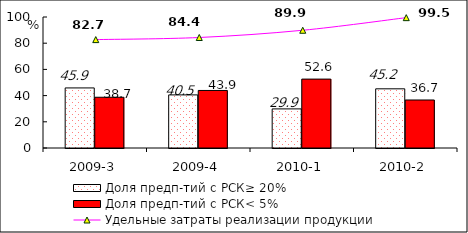
| Category | Доля предп-тий с РСК≥ 20% | Доля предп-тий с РСК< 5% |
|---|---|---|
| 2009-3 | 45.858 | 38.729 |
| 2009-4 | 40.531 | 43.92 |
| 2010-1 | 29.852 | 52.593 |
| 2010-2 | 45.173 | 36.652 |